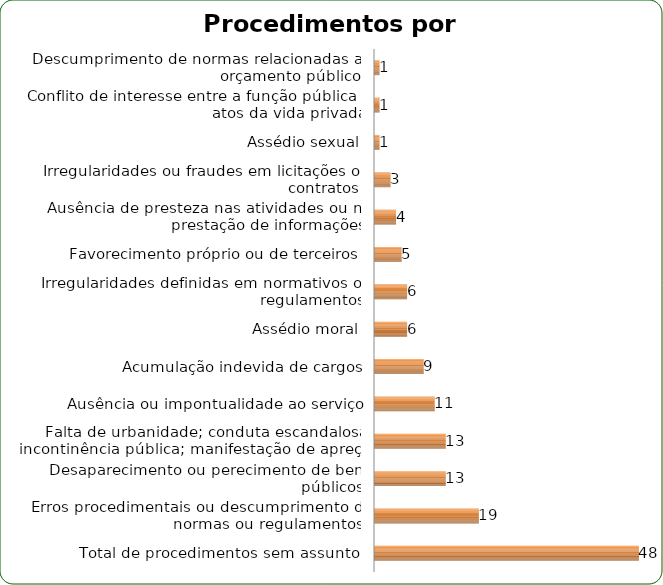
| Category | Series 0 |
|---|---|
| Total de procedimentos sem assunto  | 48 |
| Erros procedimentais ou descumprimento de normas ou regulamentos  | 19 |
| Desaparecimento ou perecimento de bens públicos | 13 |
| Falta de urbanidade; conduta escandalosa; incontinência pública; manifestação de apreço | 13 |
| Ausência ou impontualidade ao serviço | 11 |
| Acumulação indevida de cargos | 9 |
| Assédio moral | 6 |
| Irregularidades definidas em normativos ou regulamentos | 6 |
| Favorecimento próprio ou de terceiros  | 5 |
| Ausência de presteza nas atividades ou na prestação de informações | 4 |
| Irregularidades ou fraudes em licitações ou contratos  | 3 |
| Assédio sexual | 1 |
| Conflito de interesse entre a função pública e atos da vida privada | 1 |
| Descumprimento de normas relacionadas ao orçamento público  | 1 |